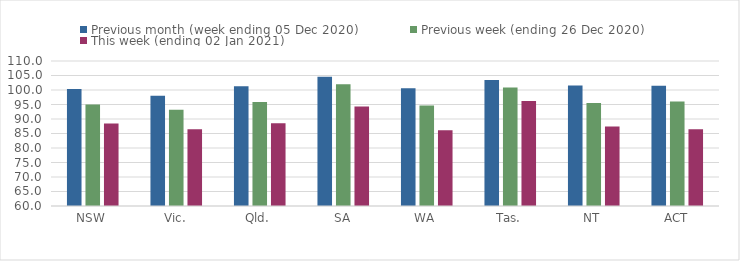
| Category | Previous month (week ending 05 Dec 2020) | Previous week (ending 26 Dec 2020) | This week (ending 02 Jan 2021) |
|---|---|---|---|
| NSW | 100.35 | 95.02 | 88.45 |
| Vic. | 98.04 | 93.22 | 86.49 |
| Qld. | 101.33 | 95.88 | 88.5 |
| SA | 104.55 | 101.97 | 94.32 |
| WA | 100.64 | 94.67 | 86.13 |
| Tas. | 103.44 | 100.89 | 96.25 |
| NT | 101.58 | 95.48 | 87.45 |
| ACT | 101.5 | 96.01 | 86.43 |